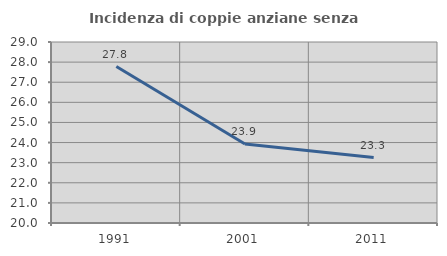
| Category | Incidenza di coppie anziane senza figli  |
|---|---|
| 1991.0 | 27.778 |
| 2001.0 | 23.926 |
| 2011.0 | 23.256 |